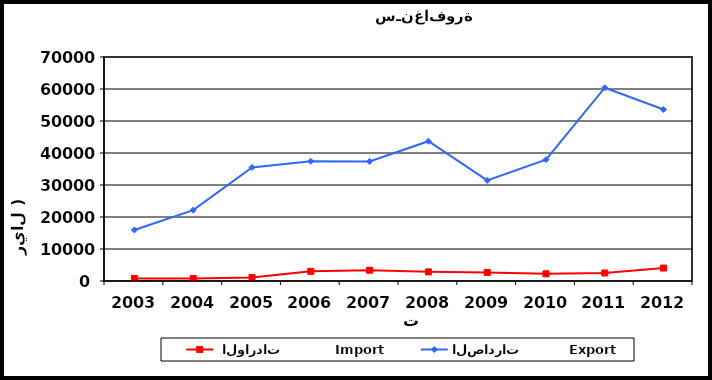
| Category |  الواردات           Import | الصادرات          Export |
|---|---|---|
| 2003.0 | 800 | 15940 |
| 2004.0 | 791 | 22147 |
| 2005.0 | 1094 | 35488 |
| 2006.0 | 3020 | 37405 |
| 2007.0 | 3381 | 37360 |
| 2008.0 | 2854 | 43693 |
| 2009.0 | 2635 | 31429 |
| 2010.0 | 2242 | 37931 |
| 2011.0 | 2506 | 60398 |
| 2012.0 | 4044 | 53582 |